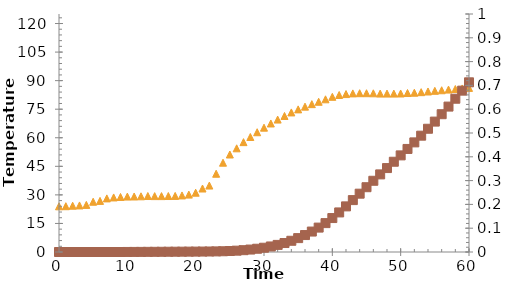
| Category | Experimental data |
|---|---|
| 0.0 | 24 |
| 1.0 | 24.05 |
| 2.0 | 24.3 |
| 3.0 | 24.45 |
| 4.0 | 24.75 |
| 5.0 | 26.4 |
| 6.0 | 26.85 |
| 7.0 | 28.15 |
| 8.0 | 28.65 |
| 9.0 | 28.9 |
| 10.0 | 29.1 |
| 11.0 | 29.15 |
| 12.0 | 29.25 |
| 13.0 | 29.4 |
| 14.0 | 29.35 |
| 15.0 | 29.35 |
| 16.0 | 29.4 |
| 17.0 | 29.45 |
| 18.0 | 29.7 |
| 19.0 | 30.15 |
| 20.0 | 31.15 |
| 21.0 | 33.35 |
| 22.0 | 34.9 |
| 23.0 | 41.1 |
| 24.0 | 46.9 |
| 25.0 | 51.2 |
| 26.0 | 54.45 |
| 27.0 | 57.7 |
| 28.0 | 60.4 |
| 29.0 | 62.9 |
| 30.0 | 65.3 |
| 31.0 | 67.5 |
| 32.0 | 69.55 |
| 33.0 | 71.45 |
| 34.0 | 73.3 |
| 35.0 | 74.9 |
| 36.0 | 76.35 |
| 37.0 | 77.65 |
| 38.0 | 78.9 |
| 39.0 | 80.2 |
| 40.0 | 81.5 |
| 41.0 | 82.45 |
| 42.0 | 82.95 |
| 43.0 | 83.3 |
| 44.0 | 83.4 |
| 45.0 | 83.4 |
| 46.0 | 83.35 |
| 47.0 | 83.2 |
| 48.0 | 83.2 |
| 49.0 | 83.2 |
| 50.0 | 83.25 |
| 51.0 | 83.5 |
| 52.0 | 83.65 |
| 53.0 | 83.95 |
| 54.0 | 84.3 |
| 55.0 | 84.65 |
| 56.0 | 84.95 |
| 57.0 | 85.3 |
| 58.0 | 85.6 |
| 59.0 | 85.9 |
| 60.0 | 86.2 |
| 61.0 | 86.5 |